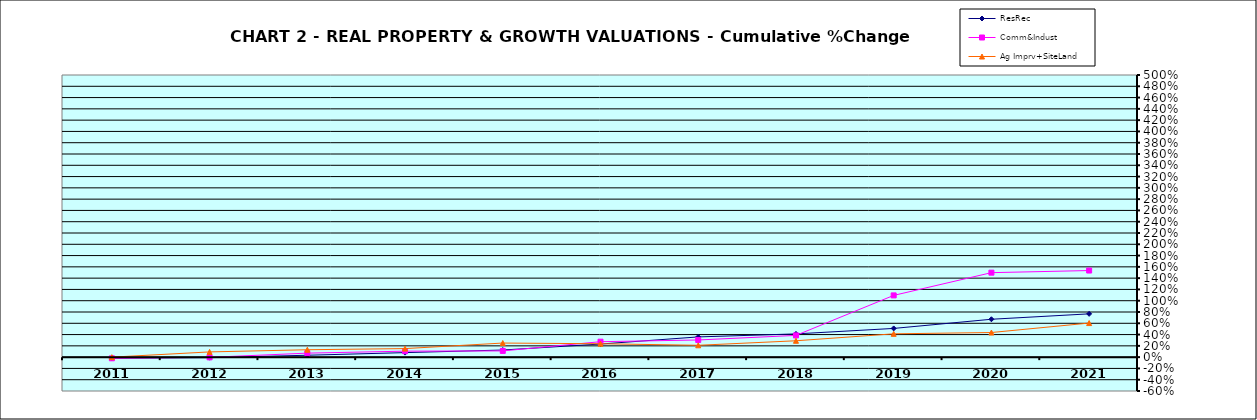
| Category | ResRec | Comm&Indust | Ag Imprv+SiteLand |
|---|---|---|---|
| 2011.0 | -0.017 | -0.02 | 0 |
| 2012.0 | -0.009 | -0.004 | 0.093 |
| 2013.0 | 0.034 | 0.071 | 0.131 |
| 2014.0 | 0.08 | 0.106 | 0.152 |
| 2015.0 | 0.126 | 0.11 | 0.25 |
| 2016.0 | 0.232 | 0.274 | 0.237 |
| 2017.0 | 0.359 | 0.304 | 0.21 |
| 2018.0 | 0.412 | 0.385 | 0.29 |
| 2019.0 | 0.509 | 1.094 | 0.413 |
| 2020.0 | 0.671 | 1.497 | 0.436 |
| 2021.0 | 0.767 | 1.535 | 0.604 |